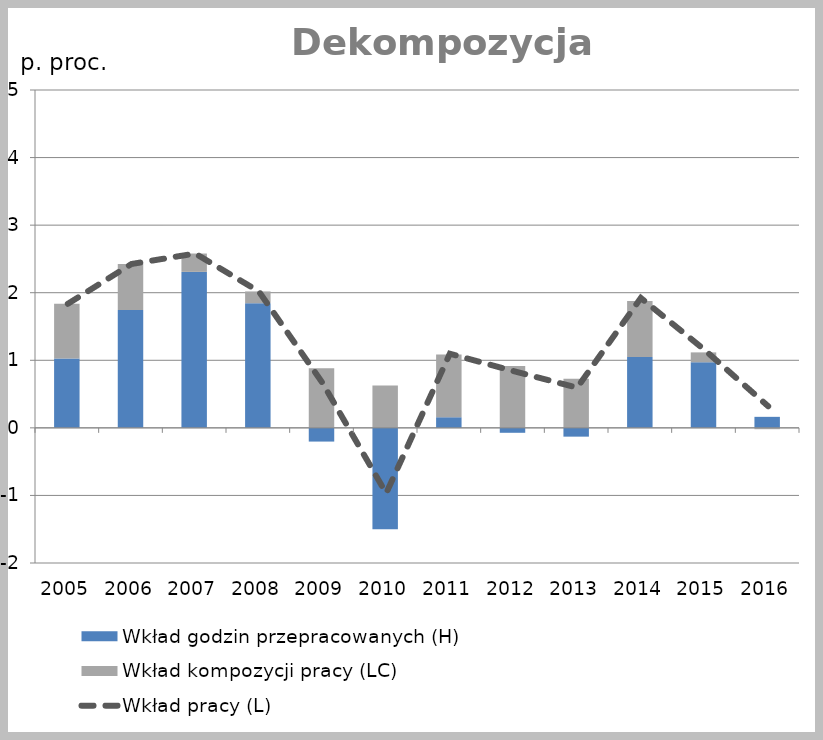
| Category | Wkład godzin przepracowanych (H) | Wkład kompozycji pracy (LC) |
|---|---|---|
| 2005.0 | 1.025 | 0.81 |
| 2006.0 | 1.746 | 0.679 |
| 2007.0 | 2.308 | 0.272 |
| 2008.0 | 1.845 | 0.174 |
| 2009.0 | -0.203 | 0.881 |
| 2010.0 | -1.5 | 0.626 |
| 2011.0 | 0.157 | 0.93 |
| 2012.0 | -0.073 | 0.915 |
| 2013.0 | -0.13 | 0.728 |
| 2014.0 | 1.047 | 0.831 |
| 2015.0 | 0.971 | 0.146 |
| 2016.0 | 0.163 | -0.02 |